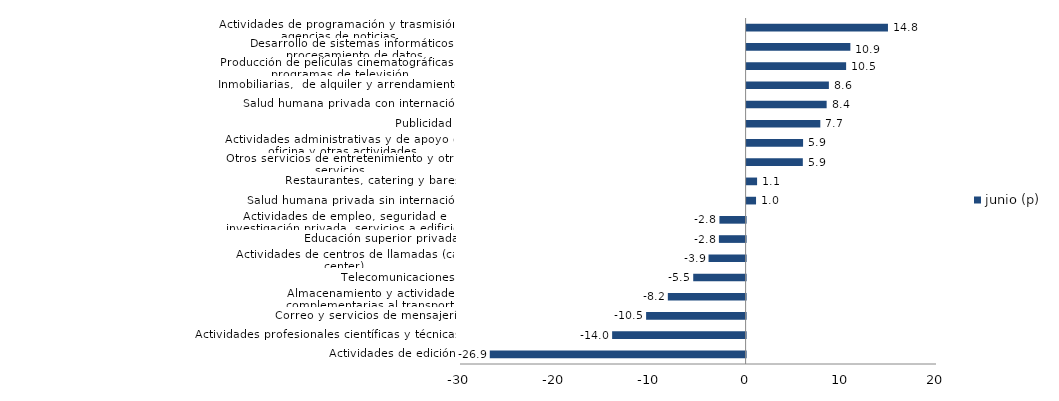
| Category | junio (p) |
|---|---|
| Actividades de edición | -26.873 |
| Actividades profesionales científicas y técnicas  | -14.02 |
| Correo y servicios de mensajería | -10.451 |
| Almacenamiento y actividades complementarias al transporte | -8.167 |
| Telecomunicaciones | -5.502 |
| Actividades de centros de llamadas (call center) | -3.892 |
| Educación superior privada | -2.803 |
| Actividades de empleo, seguridad e investigación privada, servicios a edificios | -2.752 |
| Salud humana privada sin internación | 0.992 |
| Restaurantes, catering y bares | 1.101 |
| Otros servicios de entretenimiento y otros servicios | 5.906 |
| Actividades administrativas y de apoyo de oficina y otras actividades | 5.932 |
| Publicidad | 7.743 |
| Salud humana privada con internación | 8.408 |
| Inmobiliarias,  de alquiler y arrendamiento  | 8.643 |
| Producción de películas cinematográficas y programas de televisión | 10.455 |
| Desarrollo de sistemas informáticos y procesamiento de datos | 10.901 |
| Actividades de programación y trasmisión,  agencias de noticias | 14.849 |